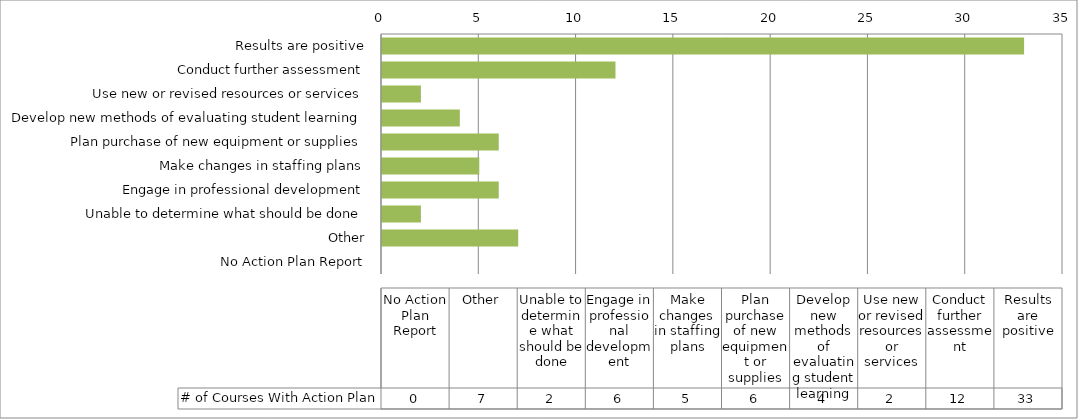
| Category | # of Courses With Action Plan |
|---|---|
| Results are positive | 33 |
| Conduct further assessment | 12 |
| Use new or revised resources or services | 2 |
| Develop new methods of evaluating student learning | 4 |
| Plan purchase of new equipment or supplies | 6 |
| Make changes in staffing plans | 5 |
| Engage in professional development | 6 |
| Unable to determine what should be done | 2 |
| Other | 7 |
| No Action Plan Report | 0 |